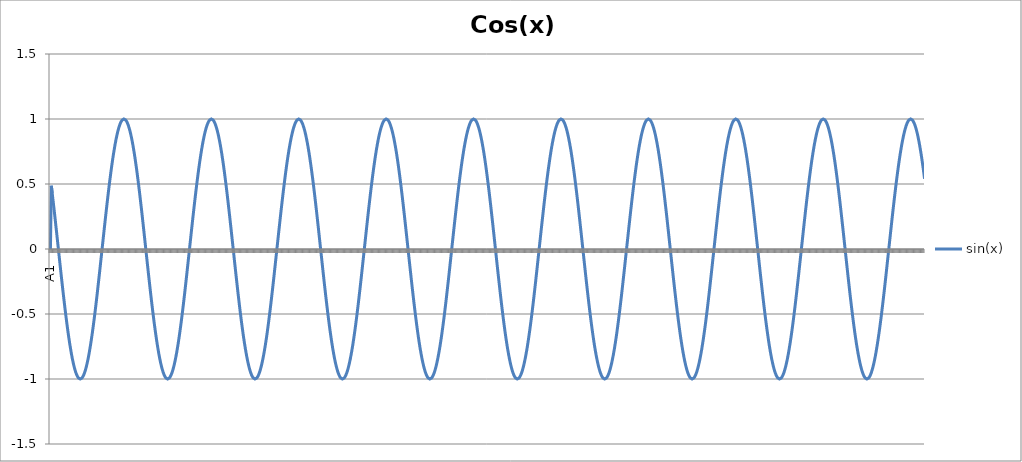
| Category | sin(x) |
|---|---|
| 0 | 0 |
| 1 | 0.486 |
| 2 | 0.431 |
| 3 | 0.373 |
| 4 | 0.314 |
| 5 | 0.254 |
| 6 | 0.193 |
| 7 | 0.131 |
| 8 | 0.068 |
| 9 | 0.005 |
| 10 | -0.057 |
| 11 | -0.12 |
| 12 | -0.182 |
| 13 | -0.244 |
| 14 | -0.304 |
| 15 | -0.363 |
| 16 | -0.421 |
| 17 | -0.477 |
| 18 | -0.531 |
| 19 | -0.583 |
| 20 | -0.633 |
| 21 | -0.681 |
| 22 | -0.725 |
| 23 | -0.767 |
| 24 | -0.806 |
| 25 | -0.841 |
| 26 | -0.874 |
| 27 | -0.903 |
| 28 | -0.928 |
| 29 | -0.949 |
| 30 | -0.967 |
| 31 | -0.981 |
| 32 | -0.991 |
| 33 | -0.998 |
| 34 | -1 |
| 35 | -0.998 |
| 36 | -0.993 |
| 37 | -0.983 |
| 38 | -0.97 |
| 39 | -0.953 |
| 40 | -0.932 |
| 41 | -0.907 |
| 42 | -0.879 |
| 43 | -0.847 |
| 44 | -0.812 |
| 45 | -0.774 |
| 46 | -0.733 |
| 47 | -0.688 |
| 48 | -0.642 |
| 49 | -0.592 |
| 50 | -0.54 |
| 51 | -0.486 |
| 52 | -0.431 |
| 53 | -0.373 |
| 54 | -0.314 |
| 55 | -0.254 |
| 56 | -0.193 |
| 57 | -0.131 |
| 58 | -0.068 |
| 59 | -0.005 |
| 60 | 0.057 |
| 61 | 0.12 |
| 62 | 0.182 |
| 63 | 0.244 |
| 64 | 0.304 |
| 65 | 0.363 |
| 66 | 0.421 |
| 67 | 0.477 |
| 68 | 0.531 |
| 69 | 0.583 |
| 70 | 0.633 |
| 71 | 0.681 |
| 72 | 0.725 |
| 73 | 0.767 |
| 74 | 0.806 |
| 75 | 0.841 |
| 76 | 0.874 |
| 77 | 0.903 |
| 78 | 0.928 |
| 79 | 0.949 |
| 80 | 0.967 |
| 81 | 0.981 |
| 82 | 0.991 |
| 83 | 0.998 |
| 84 | 1 |
| 85 | 0.998 |
| 86 | 0.993 |
| 87 | 0.983 |
| 88 | 0.97 |
| 89 | 0.953 |
| 90 | 0.932 |
| 91 | 0.907 |
| 92 | 0.879 |
| 93 | 0.847 |
| 94 | 0.812 |
| 95 | 0.774 |
| 96 | 0.733 |
| 97 | 0.688 |
| 98 | 0.642 |
| 99 | 0.592 |
| 100 | 0.54 |
| 101 | 0.486 |
| 102 | 0.431 |
| 103 | 0.373 |
| 104 | 0.314 |
| 105 | 0.254 |
| 106 | 0.193 |
| 107 | 0.131 |
| 108 | 0.068 |
| 109 | 0.005 |
| 110 | -0.057 |
| 111 | -0.12 |
| 112 | -0.182 |
| 113 | -0.244 |
| 114 | -0.304 |
| 115 | -0.363 |
| 116 | -0.421 |
| 117 | -0.477 |
| 118 | -0.531 |
| 119 | -0.583 |
| 120 | -0.633 |
| 121 | -0.681 |
| 122 | -0.725 |
| 123 | -0.767 |
| 124 | -0.806 |
| 125 | -0.841 |
| 126 | -0.874 |
| 127 | -0.903 |
| 128 | -0.928 |
| 129 | -0.949 |
| 130 | -0.967 |
| 131 | -0.981 |
| 132 | -0.991 |
| 133 | -0.998 |
| 134 | -1 |
| 135 | -0.998 |
| 136 | -0.993 |
| 137 | -0.983 |
| 138 | -0.97 |
| 139 | -0.953 |
| 140 | -0.932 |
| 141 | -0.907 |
| 142 | -0.879 |
| 143 | -0.847 |
| 144 | -0.812 |
| 145 | -0.774 |
| 146 | -0.733 |
| 147 | -0.688 |
| 148 | -0.642 |
| 149 | -0.592 |
| 150 | -0.54 |
| 151 | -0.486 |
| 152 | -0.431 |
| 153 | -0.373 |
| 154 | -0.314 |
| 155 | -0.254 |
| 156 | -0.193 |
| 157 | -0.131 |
| 158 | -0.068 |
| 159 | -0.005 |
| 160 | 0.057 |
| 161 | 0.12 |
| 162 | 0.182 |
| 163 | 0.244 |
| 164 | 0.304 |
| 165 | 0.363 |
| 166 | 0.421 |
| 167 | 0.477 |
| 168 | 0.531 |
| 169 | 0.583 |
| 170 | 0.633 |
| 171 | 0.681 |
| 172 | 0.725 |
| 173 | 0.767 |
| 174 | 0.806 |
| 175 | 0.841 |
| 176 | 0.874 |
| 177 | 0.903 |
| 178 | 0.928 |
| 179 | 0.949 |
| 180 | 0.967 |
| 181 | 0.981 |
| 182 | 0.991 |
| 183 | 0.998 |
| 184 | 1 |
| 185 | 0.998 |
| 186 | 0.993 |
| 187 | 0.983 |
| 188 | 0.97 |
| 189 | 0.953 |
| 190 | 0.932 |
| 191 | 0.907 |
| 192 | 0.879 |
| 193 | 0.847 |
| 194 | 0.812 |
| 195 | 0.774 |
| 196 | 0.733 |
| 197 | 0.688 |
| 198 | 0.642 |
| 199 | 0.592 |
| 200 | 0.54 |
| 201 | 0.486 |
| 202 | 0.431 |
| 203 | 0.373 |
| 204 | 0.314 |
| 205 | 0.254 |
| 206 | 0.193 |
| 207 | 0.131 |
| 208 | 0.068 |
| 209 | 0.005 |
| 210 | -0.057 |
| 211 | -0.12 |
| 212 | -0.182 |
| 213 | -0.244 |
| 214 | -0.304 |
| 215 | -0.363 |
| 216 | -0.421 |
| 217 | -0.477 |
| 218 | -0.531 |
| 219 | -0.583 |
| 220 | -0.633 |
| 221 | -0.681 |
| 222 | -0.725 |
| 223 | -0.767 |
| 224 | -0.806 |
| 225 | -0.841 |
| 226 | -0.874 |
| 227 | -0.903 |
| 228 | -0.928 |
| 229 | -0.949 |
| 230 | -0.967 |
| 231 | -0.981 |
| 232 | -0.991 |
| 233 | -0.998 |
| 234 | -1 |
| 235 | -0.998 |
| 236 | -0.993 |
| 237 | -0.983 |
| 238 | -0.97 |
| 239 | -0.953 |
| 240 | -0.932 |
| 241 | -0.907 |
| 242 | -0.879 |
| 243 | -0.847 |
| 244 | -0.812 |
| 245 | -0.774 |
| 246 | -0.733 |
| 247 | -0.688 |
| 248 | -0.642 |
| 249 | -0.592 |
| 250 | -0.54 |
| 251 | -0.486 |
| 252 | -0.431 |
| 253 | -0.373 |
| 254 | -0.314 |
| 255 | -0.254 |
| 256 | -0.193 |
| 257 | -0.131 |
| 258 | -0.068 |
| 259 | -0.005 |
| 260 | 0.057 |
| 261 | 0.12 |
| 262 | 0.182 |
| 263 | 0.244 |
| 264 | 0.304 |
| 265 | 0.363 |
| 266 | 0.421 |
| 267 | 0.477 |
| 268 | 0.531 |
| 269 | 0.583 |
| 270 | 0.633 |
| 271 | 0.681 |
| 272 | 0.725 |
| 273 | 0.767 |
| 274 | 0.806 |
| 275 | 0.841 |
| 276 | 0.874 |
| 277 | 0.903 |
| 278 | 0.928 |
| 279 | 0.949 |
| 280 | 0.967 |
| 281 | 0.981 |
| 282 | 0.991 |
| 283 | 0.998 |
| 284 | 1 |
| 285 | 0.998 |
| 286 | 0.993 |
| 287 | 0.983 |
| 288 | 0.97 |
| 289 | 0.953 |
| 290 | 0.932 |
| 291 | 0.907 |
| 292 | 0.879 |
| 293 | 0.847 |
| 294 | 0.812 |
| 295 | 0.774 |
| 296 | 0.733 |
| 297 | 0.688 |
| 298 | 0.642 |
| 299 | 0.592 |
| 300 | 0.54 |
| 301 | 0.486 |
| 302 | 0.431 |
| 303 | 0.373 |
| 304 | 0.314 |
| 305 | 0.254 |
| 306 | 0.193 |
| 307 | 0.131 |
| 308 | 0.068 |
| 309 | 0.005 |
| 310 | -0.057 |
| 311 | -0.12 |
| 312 | -0.182 |
| 313 | -0.244 |
| 314 | -0.304 |
| 315 | -0.363 |
| 316 | -0.421 |
| 317 | -0.477 |
| 318 | -0.531 |
| 319 | -0.583 |
| 320 | -0.633 |
| 321 | -0.681 |
| 322 | -0.725 |
| 323 | -0.767 |
| 324 | -0.806 |
| 325 | -0.841 |
| 326 | -0.874 |
| 327 | -0.903 |
| 328 | -0.928 |
| 329 | -0.949 |
| 330 | -0.967 |
| 331 | -0.981 |
| 332 | -0.991 |
| 333 | -0.998 |
| 334 | -1 |
| 335 | -0.998 |
| 336 | -0.993 |
| 337 | -0.983 |
| 338 | -0.97 |
| 339 | -0.953 |
| 340 | -0.932 |
| 341 | -0.907 |
| 342 | -0.879 |
| 343 | -0.847 |
| 344 | -0.812 |
| 345 | -0.774 |
| 346 | -0.733 |
| 347 | -0.688 |
| 348 | -0.642 |
| 349 | -0.592 |
| 350 | -0.54 |
| 351 | -0.486 |
| 352 | -0.431 |
| 353 | -0.373 |
| 354 | -0.314 |
| 355 | -0.254 |
| 356 | -0.193 |
| 357 | -0.131 |
| 358 | -0.068 |
| 359 | -0.005 |
| 360 | 0.057 |
| 361 | 0.12 |
| 362 | 0.182 |
| 363 | 0.244 |
| 364 | 0.304 |
| 365 | 0.363 |
| 366 | 0.421 |
| 367 | 0.477 |
| 368 | 0.531 |
| 369 | 0.583 |
| 370 | 0.633 |
| 371 | 0.681 |
| 372 | 0.725 |
| 373 | 0.767 |
| 374 | 0.806 |
| 375 | 0.841 |
| 376 | 0.874 |
| 377 | 0.903 |
| 378 | 0.928 |
| 379 | 0.949 |
| 380 | 0.967 |
| 381 | 0.981 |
| 382 | 0.991 |
| 383 | 0.998 |
| 384 | 1 |
| 385 | 0.998 |
| 386 | 0.993 |
| 387 | 0.983 |
| 388 | 0.97 |
| 389 | 0.953 |
| 390 | 0.932 |
| 391 | 0.907 |
| 392 | 0.879 |
| 393 | 0.847 |
| 394 | 0.812 |
| 395 | 0.774 |
| 396 | 0.733 |
| 397 | 0.688 |
| 398 | 0.642 |
| 399 | 0.592 |
| 400 | 0.54 |
| 401 | 0.486 |
| 402 | 0.431 |
| 403 | 0.373 |
| 404 | 0.314 |
| 405 | 0.254 |
| 406 | 0.193 |
| 407 | 0.131 |
| 408 | 0.068 |
| 409 | 0.005 |
| 410 | -0.057 |
| 411 | -0.12 |
| 412 | -0.182 |
| 413 | -0.244 |
| 414 | -0.304 |
| 415 | -0.363 |
| 416 | -0.421 |
| 417 | -0.477 |
| 418 | -0.531 |
| 419 | -0.583 |
| 420 | -0.633 |
| 421 | -0.681 |
| 422 | -0.725 |
| 423 | -0.767 |
| 424 | -0.806 |
| 425 | -0.841 |
| 426 | -0.874 |
| 427 | -0.903 |
| 428 | -0.928 |
| 429 | -0.949 |
| 430 | -0.967 |
| 431 | -0.981 |
| 432 | -0.991 |
| 433 | -0.998 |
| 434 | -1 |
| 435 | -0.998 |
| 436 | -0.993 |
| 437 | -0.983 |
| 438 | -0.97 |
| 439 | -0.953 |
| 440 | -0.932 |
| 441 | -0.907 |
| 442 | -0.879 |
| 443 | -0.847 |
| 444 | -0.812 |
| 445 | -0.774 |
| 446 | -0.733 |
| 447 | -0.688 |
| 448 | -0.642 |
| 449 | -0.592 |
| 450 | -0.54 |
| 451 | -0.486 |
| 452 | -0.431 |
| 453 | -0.373 |
| 454 | -0.314 |
| 455 | -0.254 |
| 456 | -0.193 |
| 457 | -0.131 |
| 458 | -0.068 |
| 459 | -0.005 |
| 460 | 0.057 |
| 461 | 0.12 |
| 462 | 0.182 |
| 463 | 0.244 |
| 464 | 0.304 |
| 465 | 0.363 |
| 466 | 0.421 |
| 467 | 0.477 |
| 468 | 0.531 |
| 469 | 0.583 |
| 470 | 0.633 |
| 471 | 0.681 |
| 472 | 0.725 |
| 473 | 0.767 |
| 474 | 0.806 |
| 475 | 0.841 |
| 476 | 0.874 |
| 477 | 0.903 |
| 478 | 0.928 |
| 479 | 0.949 |
| 480 | 0.967 |
| 481 | 0.981 |
| 482 | 0.991 |
| 483 | 0.998 |
| 484 | 1 |
| 485 | 0.998 |
| 486 | 0.993 |
| 487 | 0.983 |
| 488 | 0.97 |
| 489 | 0.953 |
| 490 | 0.932 |
| 491 | 0.907 |
| 492 | 0.879 |
| 493 | 0.847 |
| 494 | 0.812 |
| 495 | 0.774 |
| 496 | 0.733 |
| 497 | 0.688 |
| 498 | 0.642 |
| 499 | 0.592 |
| 500 | 0.54 |
| 501 | 0.486 |
| 502 | 0.431 |
| 503 | 0.373 |
| 504 | 0.314 |
| 505 | 0.254 |
| 506 | 0.193 |
| 507 | 0.131 |
| 508 | 0.068 |
| 509 | 0.005 |
| 510 | -0.057 |
| 511 | -0.12 |
| 512 | -0.182 |
| 513 | -0.244 |
| 514 | -0.304 |
| 515 | -0.363 |
| 516 | -0.421 |
| 517 | -0.477 |
| 518 | -0.531 |
| 519 | -0.583 |
| 520 | -0.633 |
| 521 | -0.681 |
| 522 | -0.725 |
| 523 | -0.767 |
| 524 | -0.806 |
| 525 | -0.841 |
| 526 | -0.874 |
| 527 | -0.903 |
| 528 | -0.928 |
| 529 | -0.949 |
| 530 | -0.967 |
| 531 | -0.981 |
| 532 | -0.991 |
| 533 | -0.998 |
| 534 | -1 |
| 535 | -0.998 |
| 536 | -0.993 |
| 537 | -0.983 |
| 538 | -0.97 |
| 539 | -0.953 |
| 540 | -0.932 |
| 541 | -0.907 |
| 542 | -0.879 |
| 543 | -0.847 |
| 544 | -0.812 |
| 545 | -0.774 |
| 546 | -0.733 |
| 547 | -0.688 |
| 548 | -0.642 |
| 549 | -0.592 |
| 550 | -0.54 |
| 551 | -0.486 |
| 552 | -0.431 |
| 553 | -0.373 |
| 554 | -0.314 |
| 555 | -0.254 |
| 556 | -0.193 |
| 557 | -0.131 |
| 558 | -0.068 |
| 559 | -0.005 |
| 560 | 0.057 |
| 561 | 0.12 |
| 562 | 0.182 |
| 563 | 0.244 |
| 564 | 0.304 |
| 565 | 0.363 |
| 566 | 0.421 |
| 567 | 0.477 |
| 568 | 0.531 |
| 569 | 0.583 |
| 570 | 0.633 |
| 571 | 0.681 |
| 572 | 0.725 |
| 573 | 0.767 |
| 574 | 0.806 |
| 575 | 0.841 |
| 576 | 0.874 |
| 577 | 0.903 |
| 578 | 0.928 |
| 579 | 0.949 |
| 580 | 0.967 |
| 581 | 0.981 |
| 582 | 0.991 |
| 583 | 0.998 |
| 584 | 1 |
| 585 | 0.998 |
| 586 | 0.993 |
| 587 | 0.983 |
| 588 | 0.97 |
| 589 | 0.953 |
| 590 | 0.932 |
| 591 | 0.907 |
| 592 | 0.879 |
| 593 | 0.847 |
| 594 | 0.812 |
| 595 | 0.774 |
| 596 | 0.733 |
| 597 | 0.688 |
| 598 | 0.642 |
| 599 | 0.592 |
| 600 | 0.54 |
| 601 | 0.486 |
| 602 | 0.431 |
| 603 | 0.373 |
| 604 | 0.314 |
| 605 | 0.254 |
| 606 | 0.193 |
| 607 | 0.131 |
| 608 | 0.068 |
| 609 | 0.005 |
| 610 | -0.057 |
| 611 | -0.12 |
| 612 | -0.182 |
| 613 | -0.244 |
| 614 | -0.304 |
| 615 | -0.363 |
| 616 | -0.421 |
| 617 | -0.477 |
| 618 | -0.531 |
| 619 | -0.583 |
| 620 | -0.633 |
| 621 | -0.681 |
| 622 | -0.725 |
| 623 | -0.767 |
| 624 | -0.806 |
| 625 | -0.841 |
| 626 | -0.874 |
| 627 | -0.903 |
| 628 | -0.928 |
| 629 | -0.949 |
| 630 | -0.967 |
| 631 | -0.981 |
| 632 | -0.991 |
| 633 | -0.998 |
| 634 | -1 |
| 635 | -0.998 |
| 636 | -0.993 |
| 637 | -0.983 |
| 638 | -0.97 |
| 639 | -0.953 |
| 640 | -0.932 |
| 641 | -0.907 |
| 642 | -0.879 |
| 643 | -0.847 |
| 644 | -0.812 |
| 645 | -0.774 |
| 646 | -0.733 |
| 647 | -0.688 |
| 648 | -0.642 |
| 649 | -0.592 |
| 650 | -0.54 |
| 651 | -0.486 |
| 652 | -0.431 |
| 653 | -0.373 |
| 654 | -0.314 |
| 655 | -0.254 |
| 656 | -0.193 |
| 657 | -0.131 |
| 658 | -0.068 |
| 659 | -0.005 |
| 660 | 0.057 |
| 661 | 0.12 |
| 662 | 0.182 |
| 663 | 0.244 |
| 664 | 0.304 |
| 665 | 0.363 |
| 666 | 0.421 |
| 667 | 0.477 |
| 668 | 0.531 |
| 669 | 0.583 |
| 670 | 0.633 |
| 671 | 0.681 |
| 672 | 0.725 |
| 673 | 0.767 |
| 674 | 0.806 |
| 675 | 0.841 |
| 676 | 0.874 |
| 677 | 0.903 |
| 678 | 0.928 |
| 679 | 0.949 |
| 680 | 0.967 |
| 681 | 0.981 |
| 682 | 0.991 |
| 683 | 0.998 |
| 684 | 1 |
| 685 | 0.998 |
| 686 | 0.993 |
| 687 | 0.983 |
| 688 | 0.97 |
| 689 | 0.953 |
| 690 | 0.932 |
| 691 | 0.907 |
| 692 | 0.879 |
| 693 | 0.847 |
| 694 | 0.812 |
| 695 | 0.774 |
| 696 | 0.733 |
| 697 | 0.688 |
| 698 | 0.642 |
| 699 | 0.592 |
| 700 | 0.54 |
| 701 | 0.486 |
| 702 | 0.431 |
| 703 | 0.373 |
| 704 | 0.314 |
| 705 | 0.254 |
| 706 | 0.193 |
| 707 | 0.131 |
| 708 | 0.068 |
| 709 | 0.005 |
| 710 | -0.057 |
| 711 | -0.12 |
| 712 | -0.182 |
| 713 | -0.244 |
| 714 | -0.304 |
| 715 | -0.363 |
| 716 | -0.421 |
| 717 | -0.477 |
| 718 | -0.531 |
| 719 | -0.583 |
| 720 | -0.633 |
| 721 | -0.681 |
| 722 | -0.725 |
| 723 | -0.767 |
| 724 | -0.806 |
| 725 | -0.841 |
| 726 | -0.874 |
| 727 | -0.903 |
| 728 | -0.928 |
| 729 | -0.949 |
| 730 | -0.967 |
| 731 | -0.981 |
| 732 | -0.991 |
| 733 | -0.998 |
| 734 | -1 |
| 735 | -0.998 |
| 736 | -0.993 |
| 737 | -0.983 |
| 738 | -0.97 |
| 739 | -0.953 |
| 740 | -0.932 |
| 741 | -0.907 |
| 742 | -0.879 |
| 743 | -0.847 |
| 744 | -0.812 |
| 745 | -0.774 |
| 746 | -0.733 |
| 747 | -0.688 |
| 748 | -0.642 |
| 749 | -0.592 |
| 750 | -0.54 |
| 751 | -0.486 |
| 752 | -0.431 |
| 753 | -0.373 |
| 754 | -0.314 |
| 755 | -0.254 |
| 756 | -0.193 |
| 757 | -0.131 |
| 758 | -0.068 |
| 759 | -0.005 |
| 760 | 0.057 |
| 761 | 0.12 |
| 762 | 0.182 |
| 763 | 0.244 |
| 764 | 0.304 |
| 765 | 0.363 |
| 766 | 0.421 |
| 767 | 0.477 |
| 768 | 0.531 |
| 769 | 0.583 |
| 770 | 0.633 |
| 771 | 0.681 |
| 772 | 0.725 |
| 773 | 0.767 |
| 774 | 0.806 |
| 775 | 0.841 |
| 776 | 0.874 |
| 777 | 0.903 |
| 778 | 0.928 |
| 779 | 0.949 |
| 780 | 0.967 |
| 781 | 0.981 |
| 782 | 0.991 |
| 783 | 0.998 |
| 784 | 1 |
| 785 | 0.998 |
| 786 | 0.993 |
| 787 | 0.983 |
| 788 | 0.97 |
| 789 | 0.953 |
| 790 | 0.932 |
| 791 | 0.907 |
| 792 | 0.879 |
| 793 | 0.847 |
| 794 | 0.812 |
| 795 | 0.774 |
| 796 | 0.733 |
| 797 | 0.688 |
| 798 | 0.642 |
| 799 | 0.592 |
| 800 | 0.54 |
| 801 | 0.486 |
| 802 | 0.431 |
| 803 | 0.373 |
| 804 | 0.314 |
| 805 | 0.254 |
| 806 | 0.193 |
| 807 | 0.131 |
| 808 | 0.068 |
| 809 | 0.005 |
| 810 | -0.057 |
| 811 | -0.12 |
| 812 | -0.182 |
| 813 | -0.244 |
| 814 | -0.304 |
| 815 | -0.363 |
| 816 | -0.421 |
| 817 | -0.477 |
| 818 | -0.531 |
| 819 | -0.583 |
| 820 | -0.633 |
| 821 | -0.681 |
| 822 | -0.725 |
| 823 | -0.767 |
| 824 | -0.806 |
| 825 | -0.841 |
| 826 | -0.874 |
| 827 | -0.903 |
| 828 | -0.928 |
| 829 | -0.949 |
| 830 | -0.967 |
| 831 | -0.981 |
| 832 | -0.991 |
| 833 | -0.998 |
| 834 | -1 |
| 835 | -0.998 |
| 836 | -0.993 |
| 837 | -0.983 |
| 838 | -0.97 |
| 839 | -0.953 |
| 840 | -0.932 |
| 841 | -0.907 |
| 842 | -0.879 |
| 843 | -0.847 |
| 844 | -0.812 |
| 845 | -0.774 |
| 846 | -0.733 |
| 847 | -0.688 |
| 848 | -0.642 |
| 849 | -0.592 |
| 850 | -0.54 |
| 851 | -0.486 |
| 852 | -0.431 |
| 853 | -0.373 |
| 854 | -0.314 |
| 855 | -0.254 |
| 856 | -0.193 |
| 857 | -0.131 |
| 858 | -0.068 |
| 859 | -0.005 |
| 860 | 0.057 |
| 861 | 0.12 |
| 862 | 0.182 |
| 863 | 0.244 |
| 864 | 0.304 |
| 865 | 0.363 |
| 866 | 0.421 |
| 867 | 0.477 |
| 868 | 0.531 |
| 869 | 0.583 |
| 870 | 0.633 |
| 871 | 0.681 |
| 872 | 0.725 |
| 873 | 0.767 |
| 874 | 0.806 |
| 875 | 0.841 |
| 876 | 0.874 |
| 877 | 0.903 |
| 878 | 0.928 |
| 879 | 0.949 |
| 880 | 0.967 |
| 881 | 0.981 |
| 882 | 0.991 |
| 883 | 0.998 |
| 884 | 1 |
| 885 | 0.998 |
| 886 | 0.993 |
| 887 | 0.983 |
| 888 | 0.97 |
| 889 | 0.953 |
| 890 | 0.932 |
| 891 | 0.907 |
| 892 | 0.879 |
| 893 | 0.847 |
| 894 | 0.812 |
| 895 | 0.774 |
| 896 | 0.733 |
| 897 | 0.688 |
| 898 | 0.642 |
| 899 | 0.592 |
| 900 | 0.54 |
| 901 | 0.486 |
| 902 | 0.431 |
| 903 | 0.373 |
| 904 | 0.314 |
| 905 | 0.254 |
| 906 | 0.193 |
| 907 | 0.131 |
| 908 | 0.068 |
| 909 | 0.005 |
| 910 | -0.057 |
| 911 | -0.12 |
| 912 | -0.182 |
| 913 | -0.244 |
| 914 | -0.304 |
| 915 | -0.363 |
| 916 | -0.421 |
| 917 | -0.477 |
| 918 | -0.531 |
| 919 | -0.583 |
| 920 | -0.633 |
| 921 | -0.681 |
| 922 | -0.725 |
| 923 | -0.767 |
| 924 | -0.806 |
| 925 | -0.841 |
| 926 | -0.874 |
| 927 | -0.903 |
| 928 | -0.928 |
| 929 | -0.949 |
| 930 | -0.967 |
| 931 | -0.981 |
| 932 | -0.991 |
| 933 | -0.998 |
| 934 | -1 |
| 935 | -0.998 |
| 936 | -0.993 |
| 937 | -0.983 |
| 938 | -0.97 |
| 939 | -0.953 |
| 940 | -0.932 |
| 941 | -0.907 |
| 942 | -0.879 |
| 943 | -0.847 |
| 944 | -0.812 |
| 945 | -0.774 |
| 946 | -0.733 |
| 947 | -0.688 |
| 948 | -0.642 |
| 949 | -0.592 |
| 950 | -0.54 |
| 951 | -0.486 |
| 952 | -0.431 |
| 953 | -0.373 |
| 954 | -0.314 |
| 955 | -0.254 |
| 956 | -0.193 |
| 957 | -0.131 |
| 958 | -0.068 |
| 959 | -0.005 |
| 960 | 0.057 |
| 961 | 0.12 |
| 962 | 0.182 |
| 963 | 0.244 |
| 964 | 0.304 |
| 965 | 0.363 |
| 966 | 0.421 |
| 967 | 0.477 |
| 968 | 0.531 |
| 969 | 0.583 |
| 970 | 0.633 |
| 971 | 0.681 |
| 972 | 0.725 |
| 973 | 0.767 |
| 974 | 0.806 |
| 975 | 0.841 |
| 976 | 0.874 |
| 977 | 0.903 |
| 978 | 0.928 |
| 979 | 0.949 |
| 980 | 0.967 |
| 981 | 0.981 |
| 982 | 0.991 |
| 983 | 0.998 |
| 984 | 1 |
| 985 | 0.998 |
| 986 | 0.993 |
| 987 | 0.983 |
| 988 | 0.97 |
| 989 | 0.953 |
| 990 | 0.932 |
| 991 | 0.907 |
| 992 | 0.879 |
| 993 | 0.847 |
| 994 | 0.812 |
| 995 | 0.774 |
| 996 | 0.733 |
| 997 | 0.688 |
| 998 | 0.642 |
| 999 | 0.592 |
| 1000 | 0.54 |